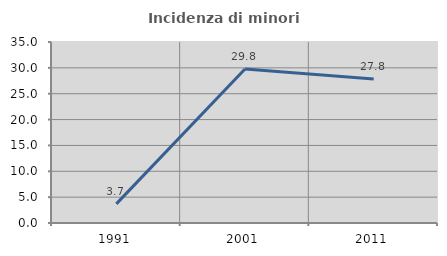
| Category | Incidenza di minori stranieri |
|---|---|
| 1991.0 | 3.704 |
| 2001.0 | 29.767 |
| 2011.0 | 27.831 |